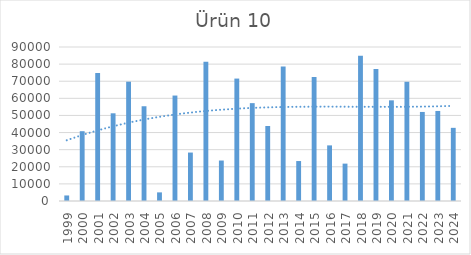
| Category | Ürün 10 |
|---|---|
| 1999.0 | 3234 |
| 2000.0 | 40795 |
| 2001.0 | 74793 |
| 2002.0 | 51253 |
| 2003.0 | 69731 |
| 2004.0 | 55377 |
| 2005.0 | 5041 |
| 2006.0 | 61628 |
| 2007.0 | 28311 |
| 2008.0 | 81358 |
| 2009.0 | 23653 |
| 2010.0 | 71547 |
| 2011.0 | 57192 |
| 2012.0 | 43823 |
| 2013.0 | 78536 |
| 2014.0 | 23353 |
| 2015.0 | 72453 |
| 2016.0 | 32501 |
| 2017.0 | 21842 |
| 2018.0 | 84931 |
| 2019.0 | 77162 |
| 2020.0 | 58826 |
| 2021.0 | 69667 |
| 2022.0 | 52040 |
| 2023.0 | 52622 |
| 2024.0 | 42756 |